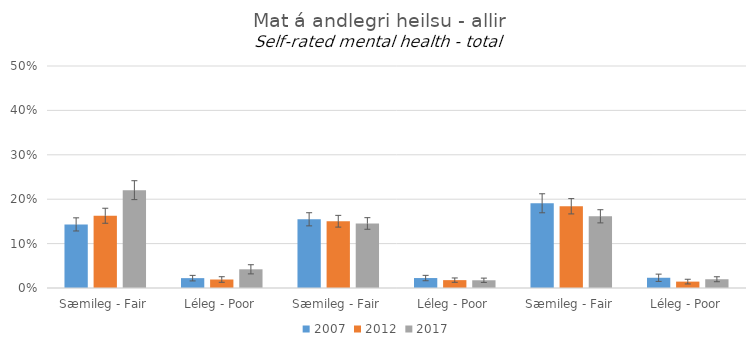
| Category | 2007 | 2012 | 2017 |
|---|---|---|---|
| 0 | 0.143 | 0.163 | 0.22 |
| 1 | 0.022 | 0.019 | 0.042 |
| 2 | 0.155 | 0.15 | 0.145 |
| 3 | 0.022 | 0.018 | 0.017 |
| 4 | 0.191 | 0.184 | 0.161 |
| 5 | 0.023 | 0.014 | 0.02 |